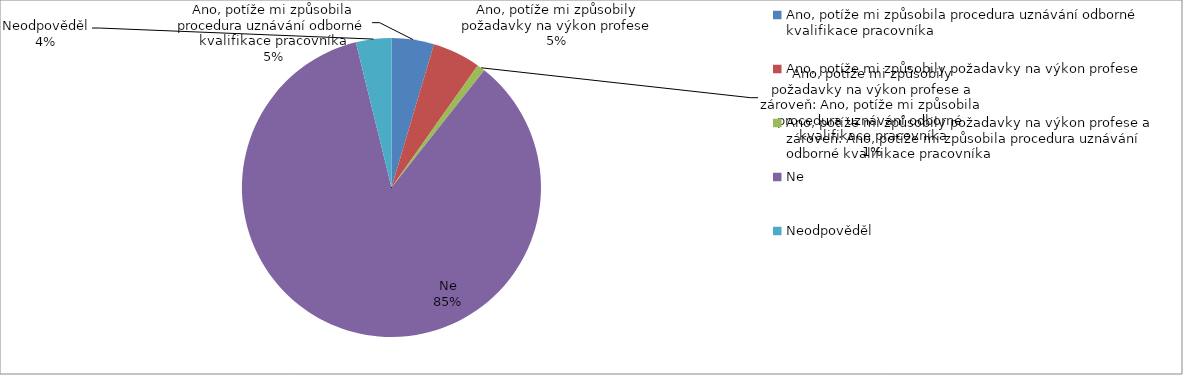
| Category | Series 0 |
|---|---|
| Ano, potíže mi způsobila procedura uznávání odborné kvalifikace pracovníka | 37 |
| Ano, potíže mi způsobily požadavky na výkon profese | 42 |
| Ano, potíže mi způsobily požadavky na výkon profese a zároveň: Ano, potíže mi způsobila procedura uznávání odborné kvalifikace pracovníka | 7 |
| Ne | 690 |
| Neodpověděl | 31 |